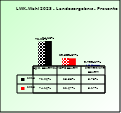
| Category | 2018 | 2023 |
|---|---|---|
| Bgld. Bauernbund | 0.721 | 0.742 |
| SPÖ Bauern | 0.236 | 0.227 |
| Freiheitliche Bauern | 0.037 | 0.032 |